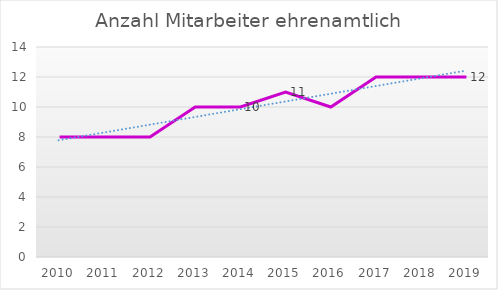
| Category | Anzahl Mitarbeiter ehrenamtlich |
|---|---|
| 2010.0 | 8 |
| 2011.0 | 8 |
| 2012.0 | 8 |
| 2013.0 | 10 |
| 2014.0 | 10 |
| 2015.0 | 11 |
| 2016.0 | 10 |
| 2017.0 | 12 |
| 2018.0 | 12 |
| 2019.0 | 12 |